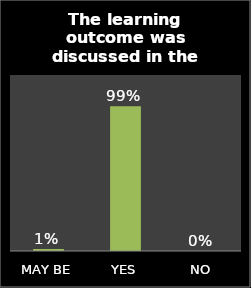
| Category | Series 0 |
|---|---|
| MAY BE | 0.013 |
| YES | 0.987 |
| NO | 0 |